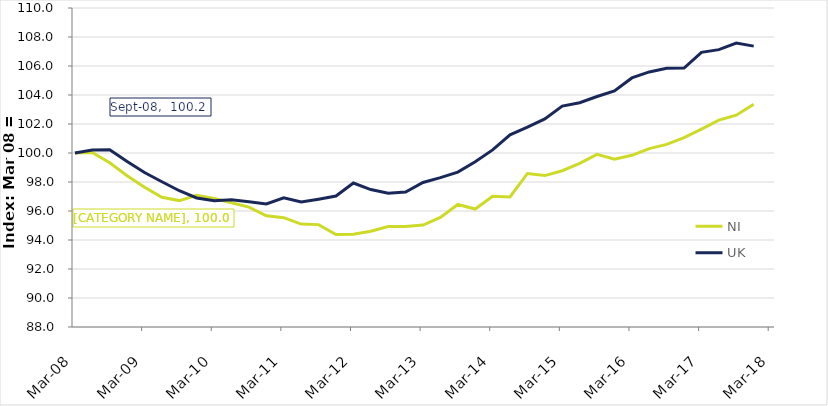
| Category | NI | UK |
|---|---|---|
| 2008-03-01 | 100 | 100 |
| 2008-06-01 | 100.035 | 100.201 |
| 2008-09-01 | 99.325 | 100.223 |
| 2008-12-01 | 98.43 | 99.417 |
| 2009-03-01 | 97.636 | 98.65 |
| 2009-06-01 | 96.944 | 98.018 |
| 2009-09-01 | 96.718 | 97.396 |
| 2009-12-01 | 97.081 | 96.898 |
| 2010-03-01 | 96.857 | 96.703 |
| 2010-06-01 | 96.572 | 96.77 |
| 2010-09-01 | 96.269 | 96.636 |
| 2010-12-01 | 95.673 | 96.484 |
| 2011-03-01 | 95.538 | 96.905 |
| 2011-06-01 | 95.1 | 96.615 |
| 2011-09-01 | 95.061 | 96.813 |
| 2011-12-01 | 94.383 | 97.035 |
| 2012-03-01 | 94.391 | 97.933 |
| 2012-06-01 | 94.604 | 97.481 |
| 2012-09-01 | 94.925 | 97.223 |
| 2012-12-01 | 94.924 | 97.311 |
| 2013-03-01 | 95.034 | 97.965 |
| 2013-06-01 | 95.563 | 98.3 |
| 2013-09-01 | 96.452 | 98.686 |
| 2013-12-01 | 96.134 | 99.399 |
| 2014-03-01 | 97.015 | 100.216 |
| 2014-06-01 | 96.966 | 101.251 |
| 2014-09-01 | 98.588 | 101.781 |
| 2014-12-01 | 98.442 | 102.353 |
| 2015-03-01 | 98.776 | 103.237 |
| 2015-06-01 | 99.281 | 103.466 |
| 2015-09-01 | 99.906 | 103.894 |
| 2015-12-01 | 99.574 | 104.286 |
| 2016-03-01 | 99.843 | 105.176 |
| 2016-06-01 | 100.299 | 105.59 |
| 2016-09-01 | 100.597 | 105.848 |
| 2016-12-01 | 101.056 | 105.855 |
| 2017-03-01 | 101.649 | 106.943 |
| 2017-06-01 | 102.271 | 107.127 |
| 2017-09-01 | 102.605 | 107.583 |
| 2017-12-01 | 103.357 | 107.371 |